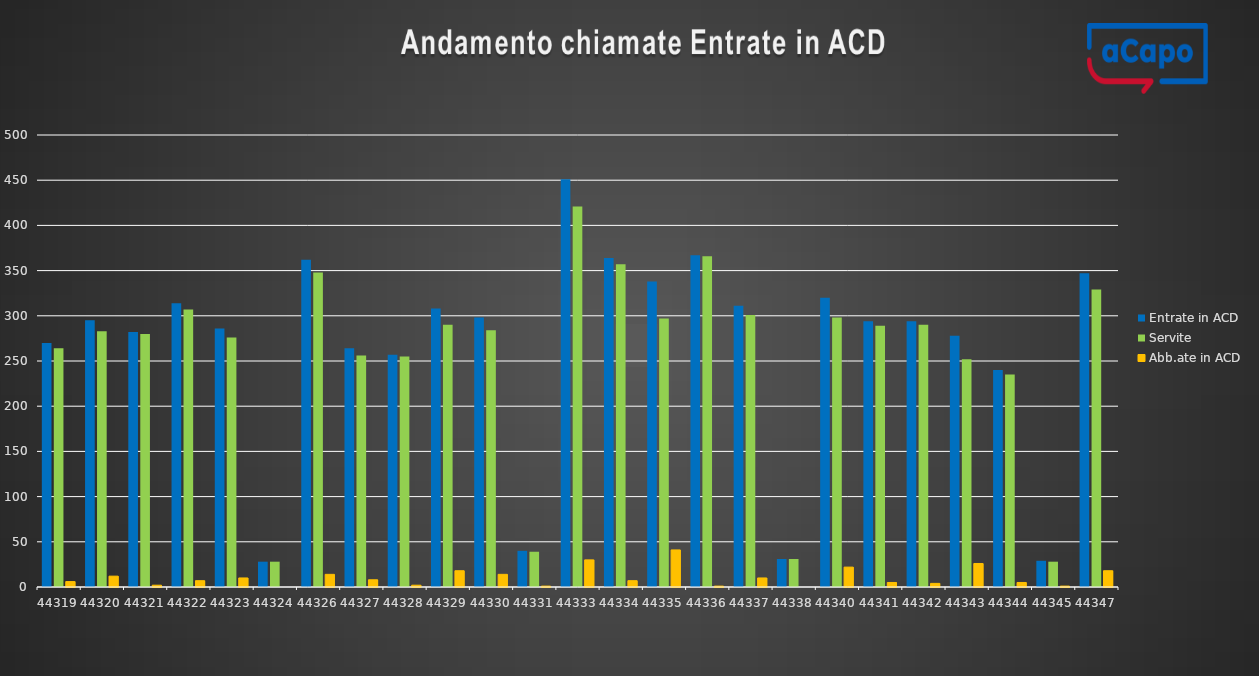
| Category | Entrate in ACD | Servite | Abb.ate in ACD |
|---|---|---|---|
| 2021-05-03 | 270 | 264 | 6 |
| 2021-05-04 | 295 | 283 | 12 |
| 2021-05-05 | 282 | 280 | 2 |
| 2021-05-06 | 314 | 307 | 7 |
| 2021-05-07 | 286 | 276 | 10 |
| 2021-05-08 | 28 | 28 | 0 |
| 2021-05-10 | 362 | 348 | 14 |
| 2021-05-11 | 264 | 256 | 8 |
| 2021-05-12 | 257 | 255 | 2 |
| 2021-05-13 | 308 | 290 | 18 |
| 2021-05-14 | 298 | 284 | 14 |
| 2021-05-15 | 40 | 39 | 1 |
| 2021-05-17 | 451 | 421 | 30 |
| 2021-05-18 | 364 | 357 | 7 |
| 2021-05-19 | 338 | 297 | 41 |
| 2021-05-20 | 367 | 366 | 1 |
| 2021-05-21 | 311 | 301 | 10 |
| 2021-05-22 | 31 | 31 | 0 |
| 2021-05-24 | 320 | 298 | 22 |
| 2021-05-25 | 294 | 289 | 5 |
| 2021-05-26 | 294 | 290 | 4 |
| 2021-05-27 | 278 | 252 | 26 |
| 2021-05-28 | 240 | 235 | 5 |
| 2021-05-29 | 29 | 28 | 1 |
| 2021-05-31 | 347 | 329 | 18 |